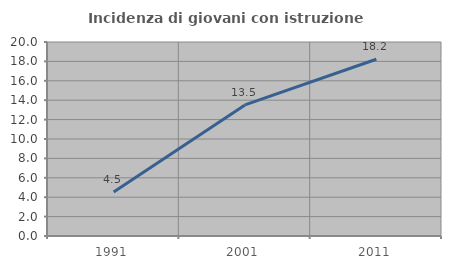
| Category | Incidenza di giovani con istruzione universitaria |
|---|---|
| 1991.0 | 4.545 |
| 2001.0 | 13.514 |
| 2011.0 | 18.219 |